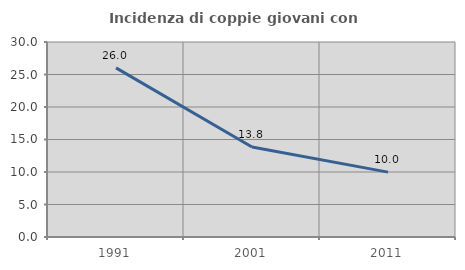
| Category | Incidenza di coppie giovani con figli |
|---|---|
| 1991.0 | 26.019 |
| 2001.0 | 13.838 |
| 2011.0 | 9.983 |